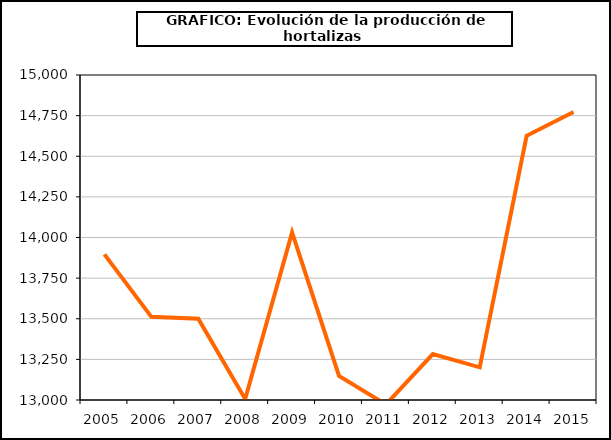
| Category | producción |
|---|---|
| 2005.0 | 13896.107 |
| 2006.0 | 13511.668 |
| 2007.0 | 13500.62 |
| 2008.0 | 13006.461 |
| 2009.0 | 14030.874 |
| 2010.0 | 13148.152 |
| 2011.0 | 12972.604 |
| 2012.0 | 13282.939 |
| 2013.0 | 13201.085 |
| 2014.0 | 14626.126 |
| 2015.0 | 14772.496 |